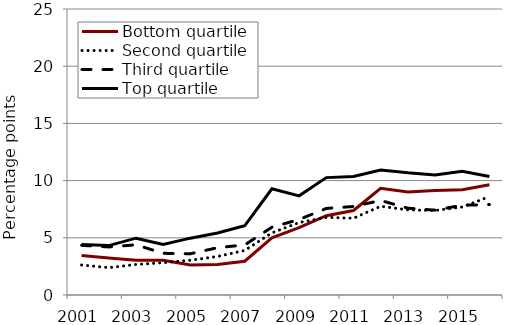
| Category | Bottom quartile | Second quartile | Third quartile | Top quartile |
|---|---|---|---|---|
| 2001.0 | 3.445 | 2.623 | 4.34 | 4.419 |
| 2002.0 | 3.245 | 2.39 | 4.202 | 4.318 |
| 2003.0 | 3.048 | 2.667 | 4.387 | 4.967 |
| 2004.0 | 3.041 | 2.825 | 3.644 | 4.41 |
| 2005.0 | 2.621 | 3.038 | 3.603 | 4.968 |
| 2006.0 | 2.67 | 3.369 | 4.134 | 5.425 |
| 2007.0 | 2.953 | 3.892 | 4.38 | 6.052 |
| 2008.0 | 5.002 | 5.43 | 5.922 | 9.283 |
| 2009.0 | 5.892 | 6.337 | 6.601 | 8.668 |
| 2010.0 | 6.932 | 6.788 | 7.565 | 10.26 |
| 2011.0 | 7.383 | 6.709 | 7.738 | 10.354 |
| 2012.0 | 9.332 | 7.759 | 8.264 | 10.932 |
| 2013.0 | 9.001 | 7.44 | 7.59 | 10.68 |
| 2014.0 | 9.13 | 7.388 | 7.416 | 10.497 |
| 2015.0 | 9.205 | 7.69 | 7.847 | 10.821 |
| 2016.0 | 9.63 | 8.603 | 7.906 | 10.363 |